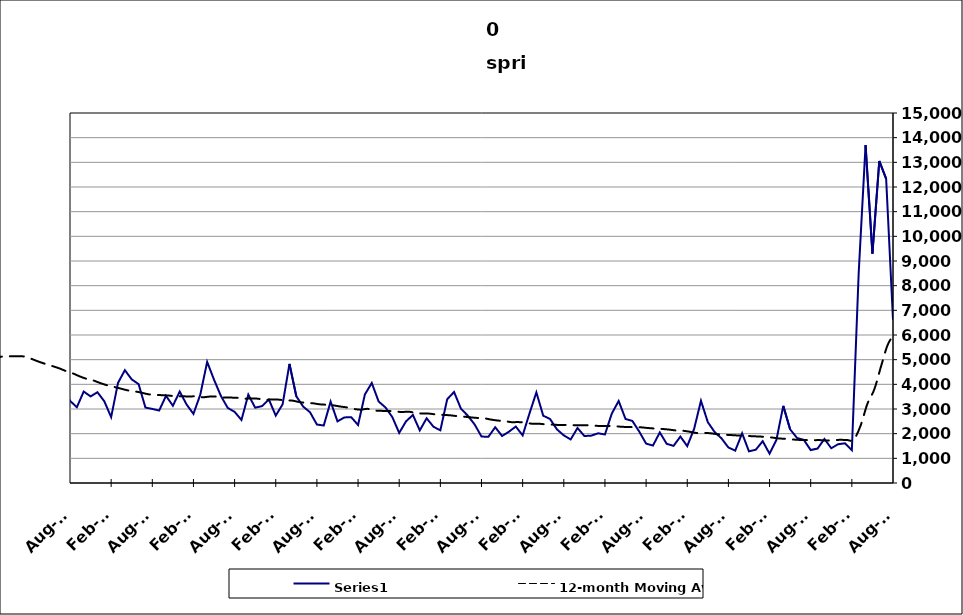
| Category | Series 0 |
|---|---|
| 2005-05-31 | 3131 |
| 2005-06-30 | 2953 |
| 2005-07-31 | 2452 |
| 2005-08-31 | 1842 |
| 2005-09-30 | 1444 |
| 2005-10-31 | 2141 |
| 2005-11-30 | 1626 |
| 2005-12-31 | 1998 |
| 2006-01-31 | 1588 |
| 2006-02-28 | 1445 |
| 2006-03-31 | 1949 |
| 2006-04-30 | 2959 |
| 2006-05-31 | 2381 |
| 2006-06-30 | 2220 |
| 2006-07-31 | 2123 |
| 2006-08-31 | 1525 |
| 2006-09-30 | 1615 |
| 2006-10-31 | 1860 |
| 2006-11-30 | 1507 |
| 2006-12-31 | 1965 |
| 2007-01-31 | 2023 |
| 2007-02-28 | 1616 |
| 2007-03-31 | 2671 |
| 2007-04-30 | 3721 |
| 2007-05-31 | 2286 |
| 2007-06-30 | 3372 |
| 2007-07-30 | 2459 |
| 2007-08-31 | 1980 |
| 2007-09-30 | 2331 |
| 2007-10-31 | 2490 |
| 2007-11-15 | 1970 |
| 2007-12-15 09:36:00 | 2318 |
| 2008-01-14 19:12:00 | 2557 |
| 2008-02-14 04:48:00 | 2676 |
| 2008-03-15 14:24:00 | 3345 |
| 2008-04-15 | 4771 |
| 2008-05-15 09:36:00 | 3529 |
| 2008-06-14 19:12:00 | 4044 |
| 2008-07-15 04:48:00 | 3468 |
| 2008-08-14 14:24:00 | 2936 |
| 2008-09-14 | 3327 |
| 2008-10-14 09:36:00 | 4398 |
| 2008-11-13 19:12:00 | 4288 |
| 2008-12-14 04:48:00 | 4919 |
| 2009-01-13 14:24:00 | 4529 |
| 2009-02-13 | 4588 |
| 2009-03-15 09:36:00 | 6230 |
| 2009-04-14 19:12:00 | 6528 |
| 2009-05-15 04:48:00 | 5710 |
| 2009-06-14 14:24:00 | 5729 |
| 2009-07-15 | 5181 |
| 2009-08-14 09:36:00 | 4471 |
| 2009-09-13 19:12:00 | 4514 |
| 2009-10-14 04:48:00 | 4928 |
| 2009-11-13 14:24:00 | 4288 |
| 2009-12-14 | 4919 |
| 2010-01-13 09:36:00 | 4406 |
| 2010-02-12 19:12:00 | 3451 |
| 2010-03-15 04:48:00 | 4910 |
| 2010-04-14 14:24:00 | 5413 |
| 2010-05-15 | 4664 |
| 2010-06-14 09:36:00 | 4652 |
| 2010-07-14 19:12:00 | 3833 |
| 2010-08-14 04:48:00 | 3333 |
| 2010-09-13 14:24:00 | 3073 |
| 2010-10-14 | 3708 |
| 2010-11-13 09:36:00 | 3510 |
| 2010-12-13 19:12:00 | 3680 |
| 2011-01-13 04:48:00 | 3314 |
| 2011-02-12 14:24:00 | 2671 |
| 2011-03-15 | 4059 |
| 2011-04-14 09:36:00 | 4574 |
| 2011-05-14 19:12:00 | 4200 |
| 2011-06-14 04:48:00 | 4010 |
| 2011-07-14 14:24:00 | 3058 |
| 2011-08-14 | 3003 |
| 2011-09-13 09:36:00 | 2938 |
| 2011-10-13 19:12:00 | 3534 |
| 2011-11-13 04:48:00 | 3132 |
| 2011-12-13 14:24:00 | 3706 |
| 2012-01-13 | 3182 |
| 2012-02-12 09:36:00 | 2802 |
| 2012-03-13 19:12:00 | 3584 |
| 2012-04-13 04:48:00 | 4909 |
| 2012-05-13 14:24:00 | 4188 |
| 2012-06-13 | 3531 |
| 2012-07-13 09:36:00 | 3044 |
| 2012-08-12 19:12:00 | 2885 |
| 2012-09-12 04:48:00 | 2556 |
| 2012-10-12 14:24:00 | 3582 |
| 2012-11-12 | 3054 |
| 2012-12-12 09:36:00 | 3117 |
| 2013-01-11 19:12:00 | 3385 |
| 2013-02-11 04:48:00 | 2732 |
| 2013-03-13 14:24:00 | 3189 |
| 2013-04-13 | 4828 |
| 2013-05-13 09:36:00 | 3513 |
| 2013-06-12 19:12:00 | 3099 |
| 2013-07-13 04:48:00 | 2867 |
| 2013-08-12 14:24:00 | 2371 |
| 2013-09-12 | 2330 |
| 2013-10-12 09:36:00 | 3301 |
| 2013-11-11 19:12:00 | 2499 |
| 2013-12-12 04:48:00 | 2658 |
| 2014-01-11 14:24:00 | 2669 |
| 2014-02-11 | 2351 |
| 2014-03-13 09:36:00 | 3592 |
| 2014-04-12 19:12:00 | 4054 |
| 2014-05-13 04:48:00 | 3305 |
| 2014-06-12 14:24:00 | 3062 |
| 2014-07-13 | 2671 |
| 2014-08-12 09:36:00 | 2031 |
| 2014-09-11 19:12:00 | 2501 |
| 2014-10-12 04:48:00 | 2759 |
| 2014-11-11 14:24:00 | 2132 |
| 2014-12-12 | 2624 |
| 2015-01-11 09:36:00 | 2280 |
| 2015-02-10 19:12:00 | 2135 |
| 2015-03-13 04:48:00 | 3396 |
| 2015-04-12 14:24:00 | 3689 |
| 2015-05-13 | 3015 |
| 2015-06-12 09:36:00 | 2729 |
| 2015-07-12 19:12:00 | 2373 |
| 2015-08-12 04:48:00 | 1884 |
| 2015-09-11 14:24:00 | 1872 |
| 2015-10-12 | 2261 |
| 2015-11-11 09:36:00 | 1906 |
| 2015-12-11 19:12:00 | 2079 |
| 2016-01-11 04:48:00 | 2289 |
| 2016-02-10 14:24:00 | 1931 |
| 2016-03-12 | 2822 |
| 2016-04-11 09:36:00 | 3674 |
| 2016-05-11 19:12:00 | 2728 |
| 2016-06-11 04:48:00 | 2594 |
| 2016-07-11 14:24:00 | 2175 |
| 2016-08-11 | 1931 |
| 2016-09-10 09:36:00 | 1765 |
| 2016-10-10 19:12:00 | 2230 |
| 2016-11-10 04:48:00 | 1905 |
| 2016-12-10 14:24:00 | 1919 |
| 2017-01-10 | 2015 |
| 2017-02-09 09:36:00 | 1968 |
| 2017-03-11 19:12:00 | 2817 |
| 2017-04-11 04:48:00 | 3325 |
| 2017-05-11 14:24:00 | 2596 |
| 2017-06-11 | 2516 |
| 2017-07-11 09:36:00 | 2084 |
| 2017-08-10 19:12:00 | 1597 |
| 2017-09-10 04:48:00 | 1518 |
| 2017-10-10 14:24:00 | 2050 |
| 2017-11-10 | 1589 |
| 2017-12-10 09:36:00 | 1505 |
| 2018-01-09 19:12:00 | 1882 |
| 2018-02-09 04:48:00 | 1495 |
| 2018-03-11 14:24:00 | 2194 |
| 2018-04-11 | 3332 |
| 2018-05-11 09:36:00 | 2466 |
| 2018-06-10 19:12:00 | 2063 |
| 2018-07-11 04:48:00 | 1809 |
| 2018-08-10 14:24:00 | 1440 |
| 2018-09-10 | 1313 |
| 2018-10-10 09:36:00 | 2015 |
| 2018-11-09 19:12:00 | 1282 |
| 2018-12-10 04:48:00 | 1351 |
| 2019-01-09 14:24:00 | 1695 |
| 2019-02-09 | 1189 |
| 2019-03-11 09:36:00 | 1746 |
| 2019-04-10 19:12:00 | 3126 |
| 2019-05-11 04:48:00 | 2174 |
| 2019-06-10 14:24:00 | 1827 |
| 2019-07-11 | 1744 |
| 2019-08-10 09:36:00 | 1335 |
| 2019-09-09 19:12:00 | 1398 |
| 2019-10-10 04:48:00 | 1790 |
| 2019-11-09 14:24:00 | 1407 |
| 2019-12-10 | 1573 |
| 2020-01-09 09:36:00 | 1610 |
| 2020-02-08 19:12:00 | 1333 |
| 2020-03-10 04:48:00 | 8532 |
| 2020-04-09 14:24:00 | 13699 |
| 2020-05-10 | 9300 |
| 2020-06-09 09:36:00 | 13055 |
| 2020-07-09 19:12:00 | 12333 |
| 2020-08-09 04:48:00 | 6620 |